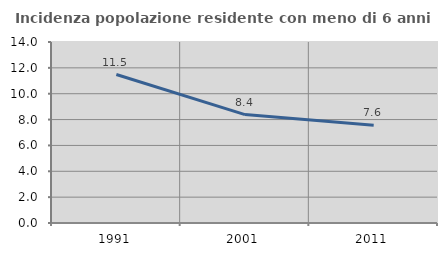
| Category | Incidenza popolazione residente con meno di 6 anni |
|---|---|
| 1991.0 | 11.482 |
| 2001.0 | 8.387 |
| 2011.0 | 7.56 |